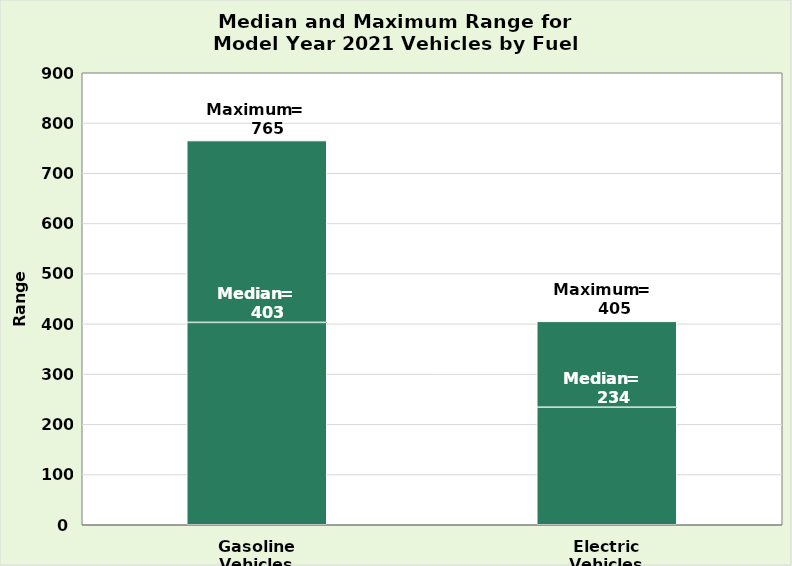
| Category | Median Range  | Difference |
|---|---|---|
| Gasoline Vehicles | 402.9 | 362.1 |
| Electric Vehicles | 234 | 171 |